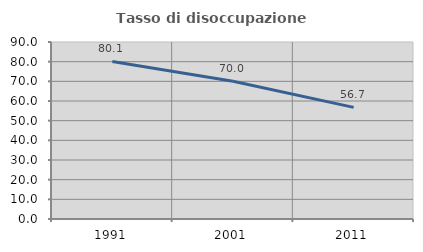
| Category | Tasso di disoccupazione giovanile  |
|---|---|
| 1991.0 | 80.105 |
| 2001.0 | 70 |
| 2011.0 | 56.742 |